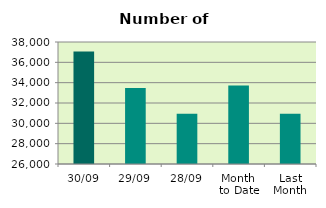
| Category | Series 0 |
|---|---|
| 30/09 | 37076 |
| 29/09 | 33484 |
| 28/09 | 30934 |
| Month 
to Date | 33733.273 |
| Last
Month | 30949.143 |